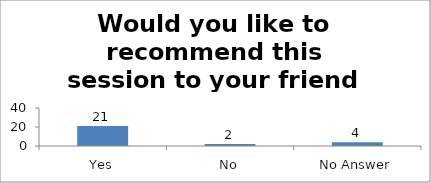
| Category | Would you like to recommend this session to your friend or colleague? |
|---|---|
| Yes | 21 |
| No | 2 |
| No Answer | 4 |